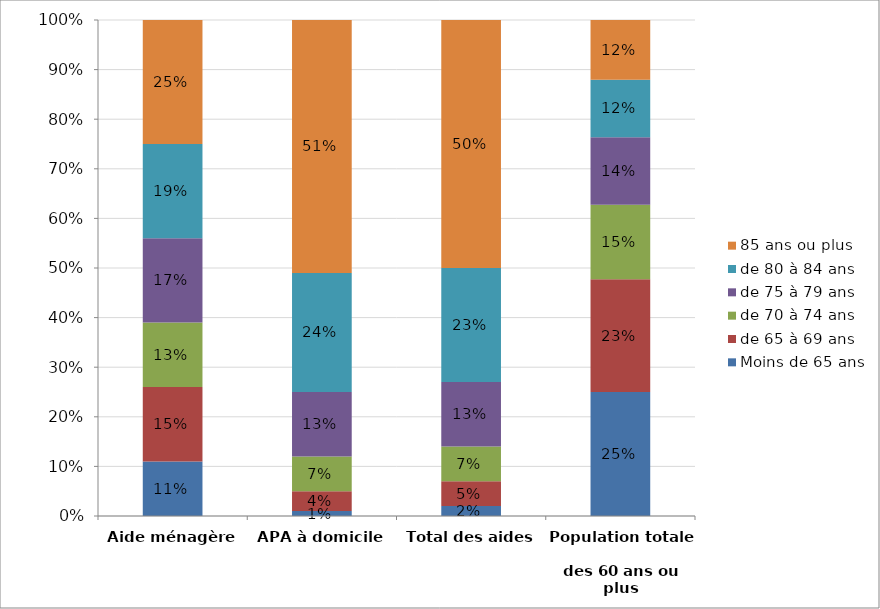
| Category | Moins de 65 ans | de 65 à 69 ans | de 70 à 74 ans | de 75 à 79 ans | de 80 à 84 ans | 85 ans ou plus |
|---|---|---|---|---|---|---|
| Aide ménagère | 0.11 | 0.15 | 0.13 | 0.17 | 0.19 | 0.25 |
| APA à domicile | 0.01 | 0.04 | 0.07 | 0.13 | 0.24 | 0.51 |
| Total des aides | 0.02 | 0.05 | 0.07 | 0.13 | 0.23 | 0.5 |
| Population totale 
des 60 ans ou plus | 0.25 | 0.227 | 0.15 | 0.136 | 0.116 | 0.12 |